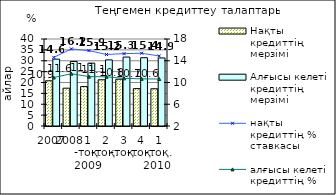
| Category | Нақты кредиттің мерзімі  | Алғысы келетін кредиттің мерзімі |
|---|---|---|
| 2007 | 20.79 | 30.735 |
| 2008 | 17.38 | 29.665 |
| 1 -тоқ. 2009 | 18.13 | 28.9 |
| 2 -тоқ.  | 21.26 | 30.4 |
| 3 -тоқ. | 21.5 | 31.7 |
| 4 -тоқ. | 17.19 | 31.4 |
| 1 -тоқ. 2010  | 17.14 | 31.29 |